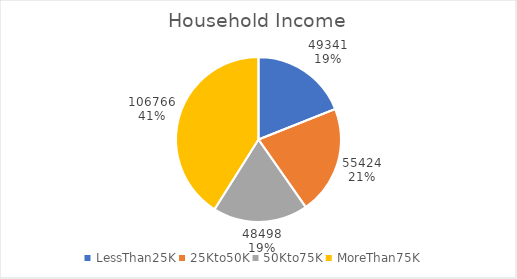
| Category | Series 0 |
|---|---|
| LessThan25K | 49341 |
| 25Kto50K | 55424 |
| 50Kto75K | 48498 |
| MoreThan75K | 106766 |